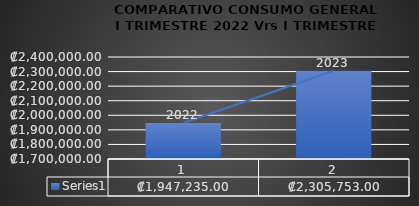
| Category | Series 0 |
|---|---|
| 0 | 1947235 |
| 1 | 2305753 |